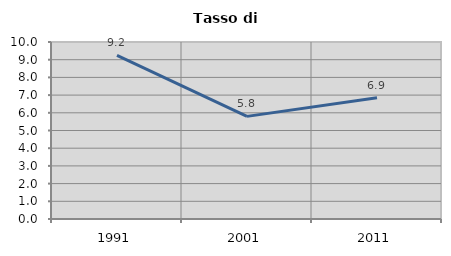
| Category | Tasso di disoccupazione   |
|---|---|
| 1991.0 | 9.242 |
| 2001.0 | 5.798 |
| 2011.0 | 6.85 |